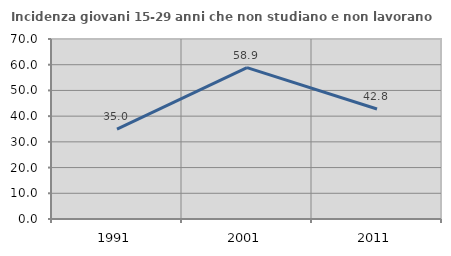
| Category | Incidenza giovani 15-29 anni che non studiano e non lavorano  |
|---|---|
| 1991.0 | 34.957 |
| 2001.0 | 58.867 |
| 2011.0 | 42.779 |